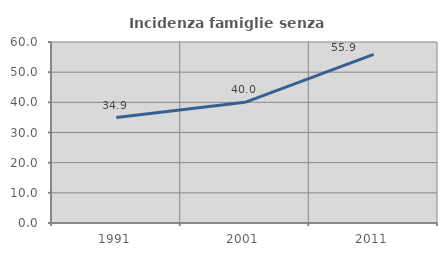
| Category | Incidenza famiglie senza nuclei |
|---|---|
| 1991.0 | 34.943 |
| 2001.0 | 40 |
| 2011.0 | 55.87 |